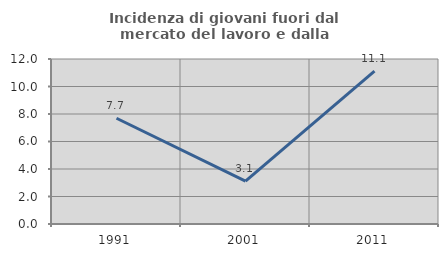
| Category | Incidenza di giovani fuori dal mercato del lavoro e dalla formazione  |
|---|---|
| 1991.0 | 7.692 |
| 2001.0 | 3.125 |
| 2011.0 | 11.111 |